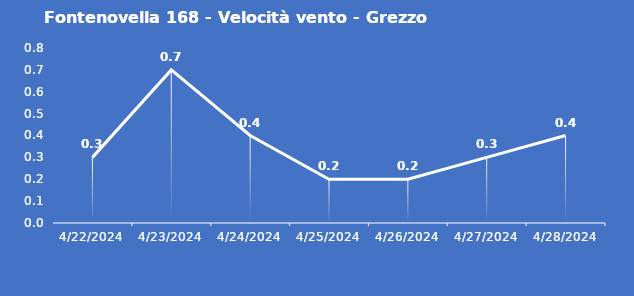
| Category | Fontenovella 168 - Velocità vento - Grezzo (m/s) |
|---|---|
| 4/22/24 | 0.3 |
| 4/23/24 | 0.7 |
| 4/24/24 | 0.4 |
| 4/25/24 | 0.2 |
| 4/26/24 | 0.2 |
| 4/27/24 | 0.3 |
| 4/28/24 | 0.4 |